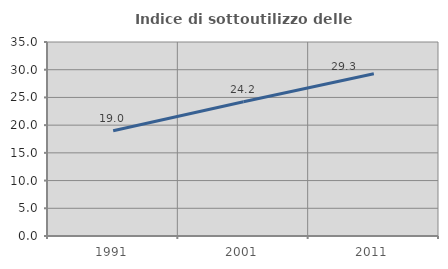
| Category | Indice di sottoutilizzo delle abitazioni  |
|---|---|
| 1991.0 | 18.992 |
| 2001.0 | 24.212 |
| 2011.0 | 29.263 |